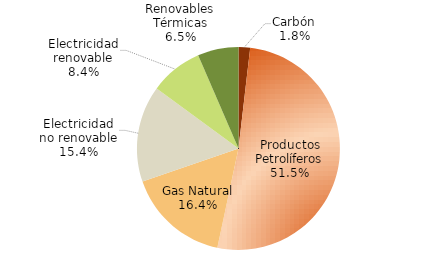
| Category | Series 0 |
|---|---|
| Carbón | 1555.836 |
| Productos Petrolíferos | 43477.115 |
| Gas Natural | 13830.244 |
| Electricidad no renovable | 12956.562 |
| Electricidad renovable | 7105.672 |
| Renovables Térmicas | 5492.509 |